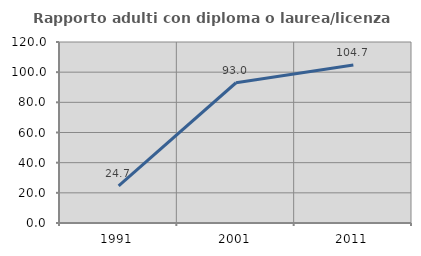
| Category | Rapporto adulti con diploma o laurea/licenza media  |
|---|---|
| 1991.0 | 24.658 |
| 2001.0 | 92.982 |
| 2011.0 | 104.721 |